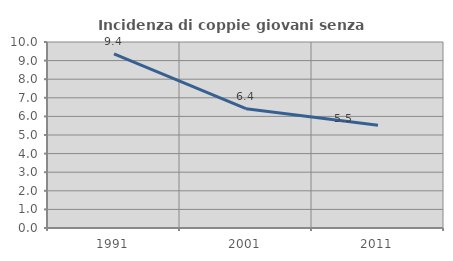
| Category | Incidenza di coppie giovani senza figli |
|---|---|
| 1991.0 | 9.356 |
| 2001.0 | 6.415 |
| 2011.0 | 5.519 |